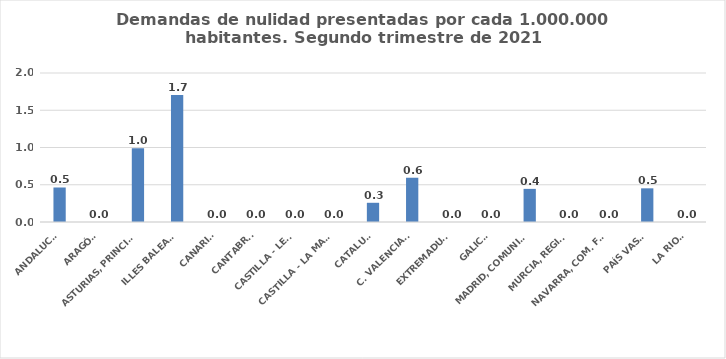
| Category | Series 0 |
|---|---|
| ANDALUCÍA | 0.463 |
| ARAGÓN | 0 |
| ASTURIAS, PRINCIPADO | 0.989 |
| ILLES BALEARS | 1.706 |
| CANARIAS | 0 |
| CANTABRIA | 0 |
| CASTILLA - LEÓN | 0 |
| CASTILLA - LA MANCHA | 0 |
| CATALUÑA | 0.258 |
| C. VALENCIANA | 0.594 |
| EXTREMADURA | 0 |
| GALICIA | 0 |
| MADRID, COMUNIDAD | 0.445 |
| MURCIA, REGIÓN | 0 |
| NAVARRA, COM. FORAL | 0 |
| PAÍS VASCO | 0.452 |
| LA RIOJA | 0 |